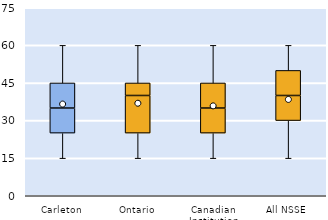
| Category | 25th | 50th | 75th |
|---|---|---|---|
| Carleton | 25 | 10 | 10 |
| Ontario | 25 | 15 | 5 |
| Canadian Institution | 25 | 10 | 10 |
| All NSSE | 30 | 10 | 10 |